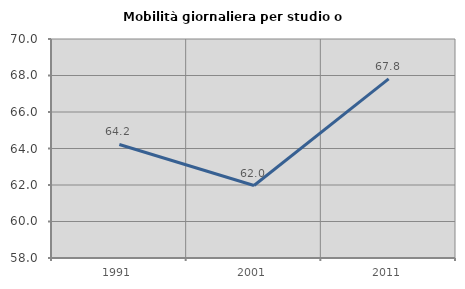
| Category | Mobilità giornaliera per studio o lavoro |
|---|---|
| 1991.0 | 64.219 |
| 2001.0 | 61.97 |
| 2011.0 | 67.819 |